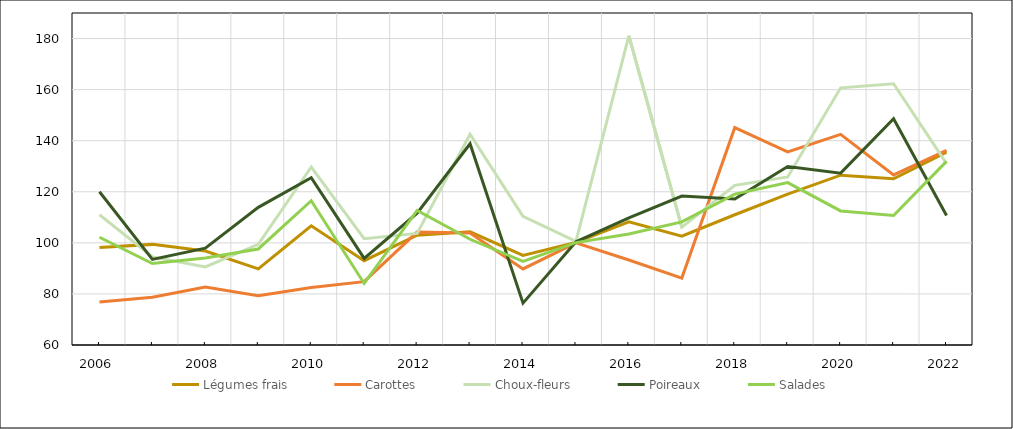
| Category | Légumes frais | Carottes | Choux-fleurs | Poireaux | Salades |
|---|---|---|---|---|---|
| 2006 | 98.2 | 76.8 | 111 | 120 | 102.2 |
| 2007 | 99.4 | 78.7 | 94.5 | 93.5 | 91.9 |
| 2008 | 96.8 | 82.7 | 90.6 | 97.9 | 94.1 |
| 2009 | 89.8 | 79.3 | 99.4 | 113.9 | 97.6 |
| 2010 | 106.7 | 82.5 | 129.7 | 125.5 | 116.5 |
| 2011 | 93 | 84.8 | 101.6 | 93.9 | 84.1 |
| 2012 | 103 | 104.2 | 103.7 | 111.6 | 112.7 |
| 2013 | 104.3 | 103.9 | 142.5 | 138.8 | 101.4 |
| 2014 | 95.1 | 89.8 | 110.4 | 76.4 | 92.7 |
| 2015 | 100.2 | 100 | 100.6 | 100.4 | 100.1 |
| 2016 | 108.2 | 93.3 | 181.1 | 109.8 | 103.5 |
| 2017 | 102.6 | 86.2 | 106.1 | 118.3 | 108.2 |
| 2018 | 111 | 145.1 | 122.5 | 117.2 | 119.1 |
| 2019 | 119.1 | 135.6 | 125.8 | 129.9 | 123.6 |
| 2020 | 126.5 | 142.5 | 160.7 | 127.3 | 112.5 |
| 2021 | 125.1 | 126.6 | 162.3 | 148.6 | 110.7 |
| 2022 | 135.5 | 136.2 | 131 | 110.7 | 131.9 |